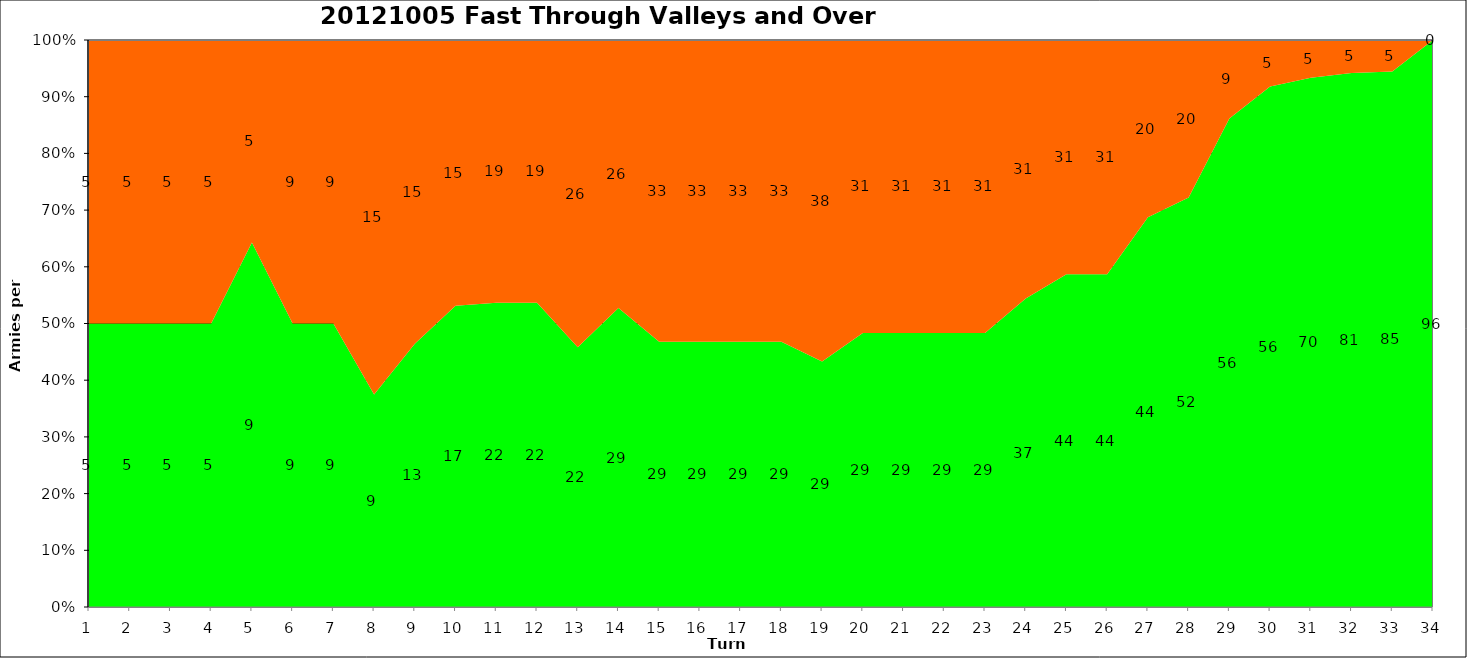
| Category | Series 0 | Series 1 |
|---|---|---|
| 1.0 | 5 | 5 |
| 2.0 | 5 | 5 |
| 3.0 | 5 | 5 |
| 4.0 | 5 | 5 |
| 5.0 | 9 | 5 |
| 6.0 | 9 | 9 |
| 7.0 | 9 | 9 |
| 8.0 | 9 | 15 |
| 9.0 | 13 | 15 |
| 10.0 | 17 | 15 |
| 11.0 | 22 | 19 |
| 12.0 | 22 | 19 |
| 13.0 | 22 | 26 |
| 14.0 | 29 | 26 |
| 15.0 | 29 | 33 |
| 16.0 | 29 | 33 |
| 17.0 | 29 | 33 |
| 18.0 | 29 | 33 |
| 19.0 | 29 | 38 |
| 20.0 | 29 | 31 |
| 21.0 | 29 | 31 |
| 22.0 | 29 | 31 |
| 23.0 | 29 | 31 |
| 24.0 | 37 | 31 |
| 25.0 | 44 | 31 |
| 26.0 | 44 | 31 |
| 27.0 | 44 | 20 |
| 28.0 | 52 | 20 |
| 29.0 | 56 | 9 |
| 30.0 | 56 | 5 |
| 31.0 | 70 | 5 |
| 32.0 | 81 | 5 |
| 33.0 | 85 | 5 |
| 34.0 | 96 | 0 |